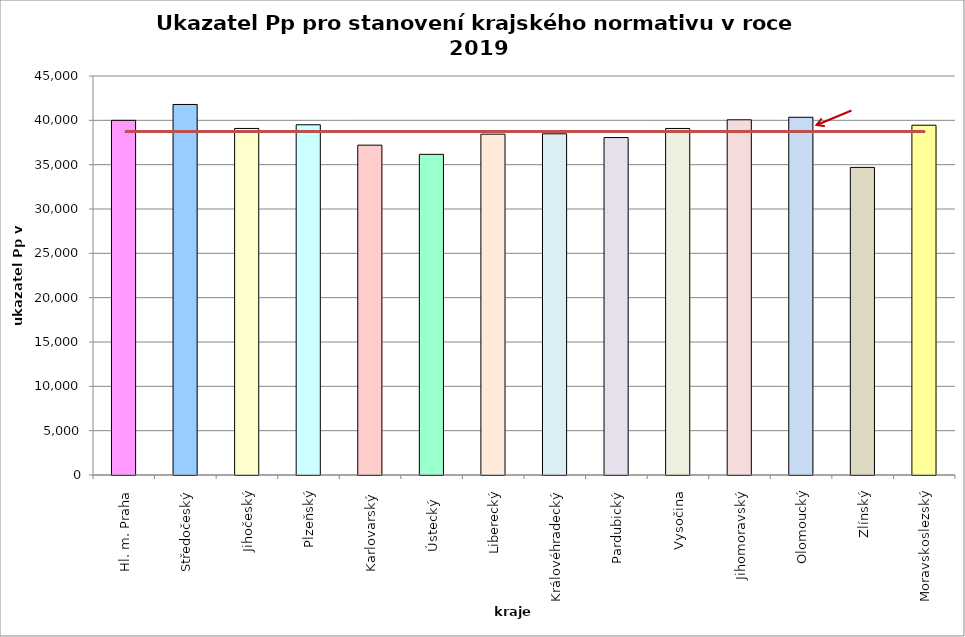
| Category | Series 0 |
|---|---|
| Hl. m. Praha | 40000 |
| Středočeský | 41791 |
| Jihočeský | 39085 |
| Plzeňský | 39500 |
| Karlovarský  | 37200 |
| Ústecký   | 36165 |
| Liberecký | 38440 |
| Královéhradecký | 38480 |
| Pardubický | 38058 |
| Vysočina | 39084 |
| Jihomoravský | 40060 |
| Olomoucký | 40347 |
| Zlínský | 34692 |
| Moravskoslezský | 39450 |